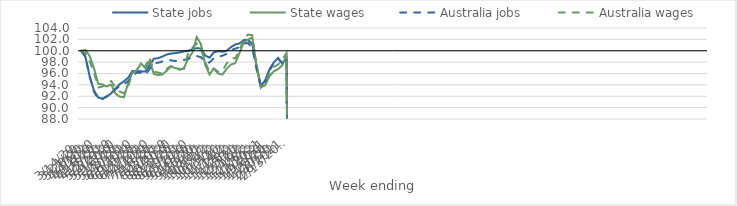
| Category | State jobs | State wages | Australia jobs | Australia wages |
|---|---|---|---|---|
| 14/03/2020 | 100 | 100 | 100 | 100 |
| 21/03/2020 | 98.947 | 100.15 | 98.956 | 99.592 |
| 28/03/2020 | 95.478 | 99.069 | 95.411 | 98.113 |
| 04/04/2020 | 92.999 | 96.909 | 92.812 | 96.235 |
| 11/04/2020 | 91.774 | 94.184 | 91.52 | 93.527 |
| 18/04/2020 | 91.579 | 94.081 | 91.496 | 93.723 |
| 25/04/2020 | 91.927 | 93.683 | 92.021 | 94.131 |
| 02/05/2020 | 92.508 | 94.112 | 92.516 | 94.682 |
| 09/05/2020 | 93.323 | 92.474 | 93.196 | 93.605 |
| 16/05/2020 | 94.121 | 91.942 | 93.786 | 92.839 |
| 23/05/2020 | 94.627 | 91.82 | 94.144 | 92.494 |
| 30/05/2020 | 95.268 | 94.305 | 94.649 | 93.8 |
| 06/06/2020 | 96.429 | 96.2 | 95.633 | 95.98 |
| 13/06/2020 | 96.424 | 96.55 | 96.135 | 96.637 |
| 20/06/2020 | 96.391 | 97.778 | 96.155 | 97.543 |
| 27/06/2020 | 96.337 | 96.933 | 95.736 | 97.22 |
| 04/07/2020 | 97.441 | 98.222 | 96.811 | 98.854 |
| 11/07/2020 | 98.601 | 95.898 | 97.797 | 96.324 |
| 18/07/2020 | 98.695 | 95.722 | 97.892 | 96.165 |
| 25/07/2020 | 98.982 | 95.825 | 98.105 | 95.98 |
| 01/08/2020 | 99.34 | 96.493 | 98.318 | 96.817 |
| 08/08/2020 | 99.501 | 97.261 | 98.31 | 97.297 |
| 15/08/2020 | 99.585 | 96.942 | 98.2 | 96.802 |
| 22/08/2020 | 99.698 | 96.768 | 98.249 | 96.652 |
| 29/08/2020 | 99.882 | 96.831 | 98.38 | 96.868 |
| 05/09/2020 | 99.962 | 98.665 | 98.54 | 99.571 |
| 12/09/2020 | 100.282 | 99.644 | 98.935 | 100.548 |
| 19/09/2020 | 100.463 | 102.401 | 99.081 | 101.275 |
| 26/09/2020 | 100.377 | 101.168 | 98.859 | 100.413 |
| 03/10/2020 | 99.174 | 97.531 | 97.958 | 97.98 |
| 10/10/2020 | 98.781 | 95.838 | 97.945 | 96.303 |
| 17/10/2020 | 99.706 | 96.854 | 98.678 | 96.878 |
| 24/10/2020 | 99.932 | 96.003 | 98.932 | 96.325 |
| 31/10/2020 | 99.816 | 95.8 | 99.127 | 96.446 |
| 07/11/2020 | 100.002 | 96.799 | 99.458 | 97.753 |
| 14/11/2020 | 100.62 | 97.572 | 100.12 | 98.654 |
| 21/11/2020 | 101.09 | 97.801 | 100.358 | 98.686 |
| 28/11/2020 | 101.296 | 99.586 | 100.609 | 100.004 |
| 05/12/2020 | 101.872 | 101.454 | 101.271 | 102.199 |
| 12/12/2020 | 101.902 | 101.974 | 101.353 | 102.847 |
| 19/12/2020 | 101.158 | 102.352 | 100.515 | 102.738 |
| 26/12/2020 | 97.407 | 97.281 | 96.696 | 97.23 |
| 02/01/2021 | 93.827 | 93.624 | 93.609 | 93.51 |
| 09/01/2021 | 94.787 | 93.93 | 94.526 | 94.153 |
| 16/01/2021 | 96.73 | 95.496 | 96.434 | 96.036 |
| 23/01/2021 | 97.91 | 96.379 | 97.839 | 97.148 |
| 30/01/2021 | 98.744 | 96.746 | 98.639 | 97.559 |
| 06/02/2021 | 97.744 | 97.452 | 97.828 | 98.431 |
| 13/02/2021 | 98.901 | 99.06 | 98.686 | 99.61 |